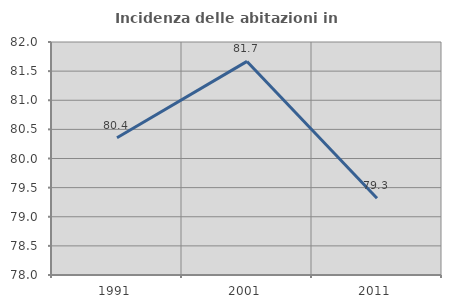
| Category | Incidenza delle abitazioni in proprietà  |
|---|---|
| 1991.0 | 80.357 |
| 2001.0 | 81.667 |
| 2011.0 | 79.319 |